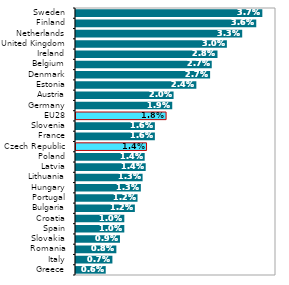
| Category |  Celkem 
(ISCO 25) |
|---|---|
| Greece | 0.006 |
| Italy | 0.007 |
| Romania | 0.008 |
| Slovakia | 0.009 |
| Spain | 0.01 |
| Croatia | 0.01 |
| Bulgaria | 0.012 |
| Portugal | 0.012 |
| Hungary | 0.013 |
| Lithuania | 0.013 |
| Latvia | 0.014 |
| Poland | 0.014 |
| Czech Republic | 0.014 |
| France | 0.016 |
| Slovenia | 0.016 |
| EU28 | 0.018 |
| Germany | 0.019 |
| Austria | 0.02 |
| Estonia | 0.024 |
| Denmark | 0.027 |
| Belgium | 0.027 |
| Ireland | 0.028 |
| United Kingdom | 0.03 |
| Netherlands | 0.033 |
| Finland | 0.036 |
| Sweden | 0.037 |